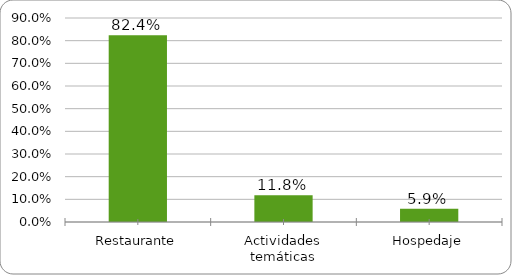
| Category | Series 0 |
|---|---|
| Restaurante | 0.824 |
| Actividades temáticas | 0.118 |
| Hospedaje | 0.059 |